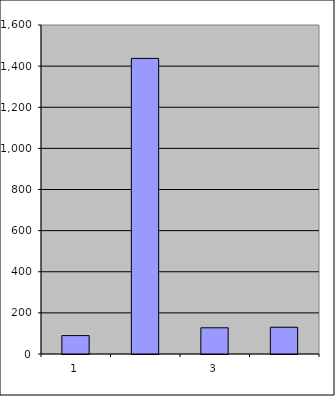
| Category | Series 0 |
|---|---|
| 0 | 89.5 |
| 1 | 1437.507 |
| 2 | 127.471 |
| 3 | 130.234 |